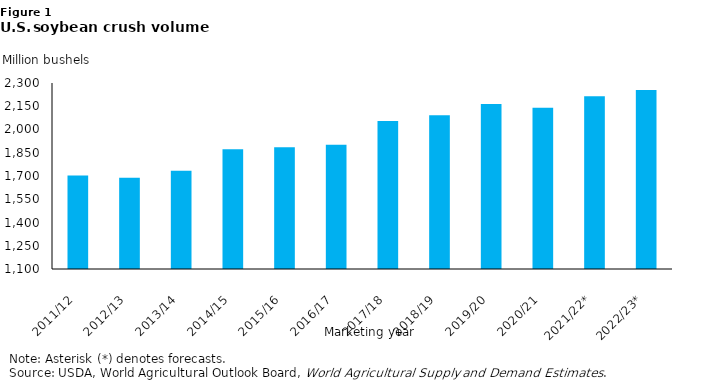
| Category | Crush Volume |
|---|---|
|  2011/12  | 1703 |
|  2012/13  | 1689 |
|  2013/14  | 1734 |
|  2014/15  | 1873 |
|  2015/16  | 1886.237 |
|  2016/17  | 1901.198 |
|  2017/18  | 2054.932 |
|  2018/19  | 2091.99 |
|  2019/20  | 2164.554 |
|  2020/21  | 2140.585 |
|  2021/22*  | 2215 |
|  2022/23*  | 2255 |